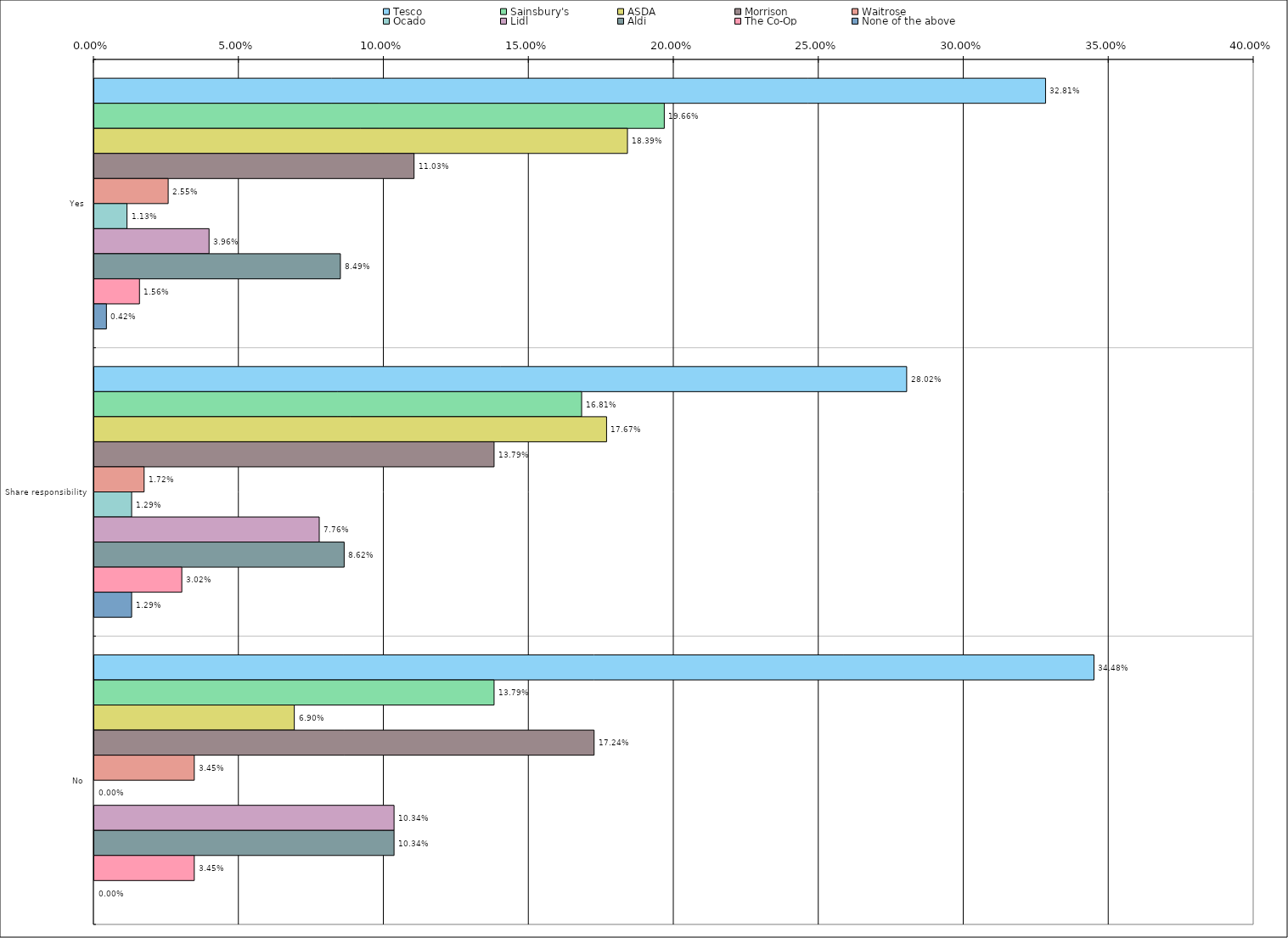
| Category | Tesco | Sainsbury's | ASDA | Morrison | Waitrose | Ocado | Lidl | Aldi | The Co-Op | None of the above |
|---|---|---|---|---|---|---|---|---|---|---|
| 0 | 0.328 | 0.197 | 0.184 | 0.11 | 0.026 | 0.011 | 0.04 | 0.085 | 0.016 | 0.004 |
| 1 | 0.28 | 0.168 | 0.177 | 0.138 | 0.017 | 0.013 | 0.078 | 0.086 | 0.03 | 0.013 |
| 2 | 0.345 | 0.138 | 0.069 | 0.172 | 0.034 | 0 | 0.103 | 0.103 | 0.034 | 0 |